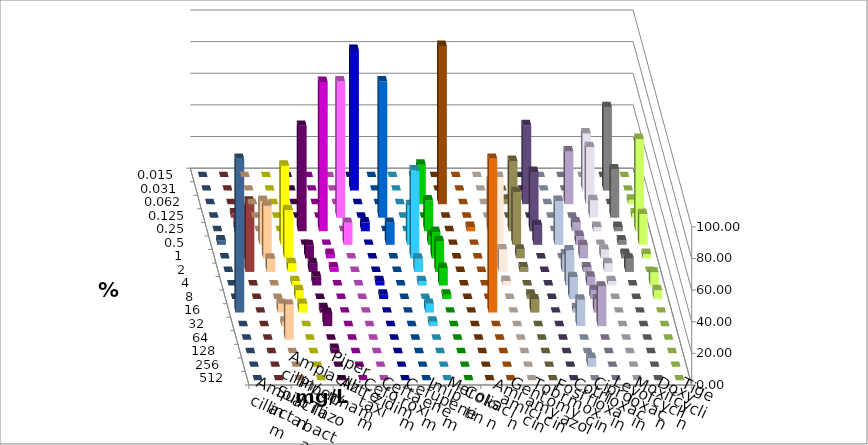
| Category | Ampicillin | Ampicillin/ Sulbactam | Piperacillin | Piperacillin/ Tazobactam | Aztreonam | Cefotaxim | Ceftazidim | Cefuroxim | Imipenem | Meropenem | Colistin | Amikacin | Gentamicin | Tobramycin | Fosfomycin | Cotrimoxazol | Ciprofloxacin | Levofloxacin | Moxifloxacin | Doxycyclin | Tigecyclin |
|---|---|---|---|---|---|---|---|---|---|---|---|---|---|---|---|---|---|---|---|---|---|
| 0.015 | 0 | 0 | 0 | 0 | 0 | 0 | 0 | 0 | 0 | 0 | 0 | 0 | 0 | 0 | 0 | 0 | 0 | 0 | 0 | 0 | 0 |
| 0.031 | 0 | 0 | 0 | 0 | 0 | 88.889 | 0 | 0 | 0 | 0 | 0 | 0 | 0 | 0 | 0 | 0 | 36.111 | 52.778 | 0 | 0 | 0 |
| 0.062 | 0 | 0 | 0 | 0 | 0 | 0 | 0 | 0 | 25 | 100 | 0 | 0 | 2.778 | 50 | 0 | 33.333 | 36.111 | 0 | 2.778 | 0 | 0 |
| 0.125 | 0 | 0 | 0 | 0 | 86.111 | 0 | 86.111 | 0 | 0 | 0 | 0 | 0 | 0 | 0 | 0 | 0 | 11.111 | 30.556 | 2.778 | 0 | 2.778 |
| 0.25 | 0 | 0 | 66.667 | 94.444 | 0 | 5.556 | 0 | 0 | 19.444 | 0 | 2.778 | 31.429 | 44.444 | 37.5 | 0 | 5.556 | 2.778 | 2.778 | 58.333 | 0 | 5.556 |
| 0.5 | 27.778 | 50 | 0 | 0 | 13.889 | 0 | 13.889 | 25 | 5.556 | 0 | 0 | 0 | 33.333 | 12.5 | 27.778 | 5.556 | 0 | 2.778 | 19.444 | 2.778 | 16.667 |
| 1.0 | 33.333 | 30.556 | 8.333 | 2.778 | 0 | 0 | 0 | 55.556 | 16.667 | 0 | 0 | 51.429 | 5.556 | 0 | 0 | 8.333 | 5.556 | 2.778 | 2.778 | 0 | 30.556 |
| 2.0 | 8.333 | 5.556 | 5.556 | 2.778 | 0 | 0 | 0 | 8.333 | 19.444 | 0 | 0 | 14.286 | 2.778 | 0 | 11.111 | 2.778 | 5.556 | 8.333 | 0 | 0 | 44.444 |
| 4.0 | 0 | 2.778 | 5.556 | 0 | 0 | 2.778 | 0 | 2.778 | 11.111 | 0 | 0 | 2.857 | 0 | 0 | 22.222 | 5.556 | 2.778 | 0 | 8.333 | 0 | 0 |
| 8.0 | 0 | 5.556 | 0 | 0 | 0 | 2.778 | 0 | 0 | 2.778 | 0 | 0 | 0 | 2.778 | 0 | 13.889 | 5.556 | 0 | 0 | 5.556 | 0 | 0 |
| 16.0 | 5.556 | 5.556 | 2.778 | 0 | 0 | 0 | 0 | 5.556 | 0 | 0 | 97.222 | 0 | 8.333 | 0 | 2.778 | 8.333 | 0 | 0 | 0 | 97.222 | 0 |
| 32.0 | 2.778 | 0 | 8.333 | 0 | 0 | 0 | 0 | 2.778 | 0 | 0 | 0 | 0 | 0 | 0 | 16.667 | 25 | 0 | 0 | 0 | 0 | 0 |
| 64.0 | 22.222 | 0 | 0 | 0 | 0 | 0 | 0 | 0 | 0 | 0 | 0 | 0 | 0 | 0 | 0 | 0 | 0 | 0 | 0 | 0 | 0 |
| 128.0 | 0 | 0 | 2.778 | 0 | 0 | 0 | 0 | 0 | 0 | 0 | 0 | 0 | 0 | 0 | 0 | 0 | 0 | 0 | 0 | 0 | 0 |
| 256.0 | 0 | 0 | 0 | 0 | 0 | 0 | 0 | 0 | 0 | 0 | 0 | 0 | 0 | 0 | 5.556 | 0 | 0 | 0 | 0 | 0 | 0 |
| 512.0 | 0 | 0 | 0 | 0 | 0 | 0 | 0 | 0 | 0 | 0 | 0 | 0 | 0 | 0 | 0 | 0 | 0 | 0 | 0 | 0 | 0 |